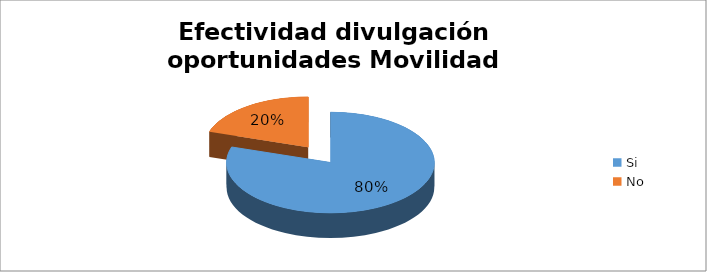
| Category | Porcentaje |
|---|---|
| Si | 0.8 |
| No | 0.2 |